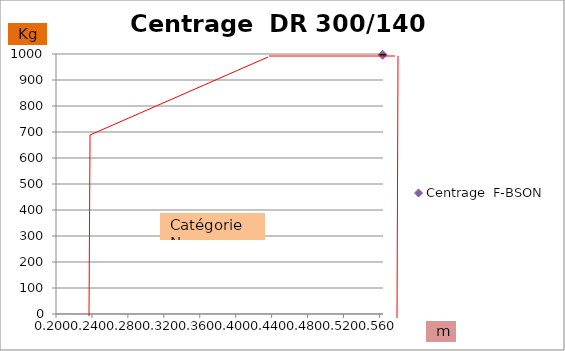
| Category | Centrage  F-BSON |
|---|---|
| 0.5636108324974926 | 997 |